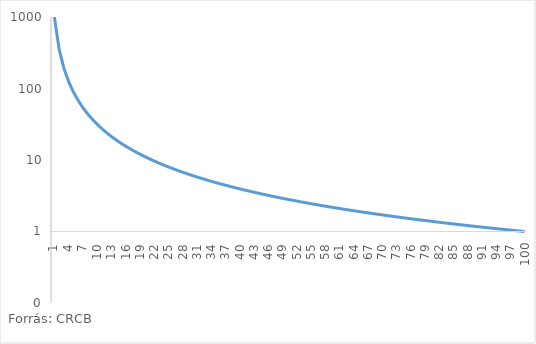
| Category | személyes kapcsolatok száma |
|---|---|
| 1.0 | 1000 |
| 2.0 | 353.553 |
| 3.0 | 192.45 |
| 4.0 | 125 |
| 5.0 | 89.443 |
| 6.0 | 68.041 |
| 7.0 | 53.995 |
| 8.0 | 44.194 |
| 9.0 | 37.037 |
| 10.0 | 31.623 |
| 11.0 | 27.41 |
| 12.0 | 24.056 |
| 13.0 | 21.335 |
| 14.0 | 19.09 |
| 15.0 | 17.213 |
| 16.0 | 15.625 |
| 17.0 | 14.267 |
| 18.0 | 13.095 |
| 19.0 | 12.075 |
| 20.0 | 11.18 |
| 21.0 | 10.391 |
| 22.0 | 9.691 |
| 23.0 | 9.066 |
| 24.0 | 8.505 |
| 25.0 | 8 |
| 26.0 | 7.543 |
| 27.0 | 7.128 |
| 28.0 | 6.749 |
| 29.0 | 6.403 |
| 30.0 | 6.086 |
| 31.0 | 5.794 |
| 32.0 | 5.524 |
| 33.0 | 5.275 |
| 34.0 | 5.044 |
| 35.0 | 4.829 |
| 36.0 | 4.63 |
| 37.0 | 4.443 |
| 38.0 | 4.269 |
| 39.0 | 4.106 |
| 40.0 | 3.953 |
| 41.0 | 3.809 |
| 42.0 | 3.674 |
| 43.0 | 3.546 |
| 44.0 | 3.426 |
| 45.0 | 3.313 |
| 46.0 | 3.205 |
| 47.0 | 3.104 |
| 48.0 | 3.007 |
| 49.0 | 2.915 |
| 50.0 | 2.828 |
| 51.0 | 2.746 |
| 52.0 | 2.667 |
| 53.0 | 2.592 |
| 54.0 | 2.52 |
| 55.0 | 2.452 |
| 56.0 | 2.386 |
| 57.0 | 2.324 |
| 58.0 | 2.264 |
| 59.0 | 2.207 |
| 60.0 | 2.152 |
| 61.0 | 2.099 |
| 62.0 | 2.048 |
| 63.0 | 2 |
| 64.0 | 1.953 |
| 65.0 | 1.908 |
| 66.0 | 1.865 |
| 67.0 | 1.823 |
| 68.0 | 1.783 |
| 69.0 | 1.745 |
| 70.0 | 1.707 |
| 71.0 | 1.672 |
| 72.0 | 1.637 |
| 73.0 | 1.603 |
| 74.0 | 1.571 |
| 75.0 | 1.54 |
| 76.0 | 1.509 |
| 77.0 | 1.48 |
| 78.0 | 1.452 |
| 79.0 | 1.424 |
| 80.0 | 1.398 |
| 81.0 | 1.372 |
| 82.0 | 1.347 |
| 83.0 | 1.322 |
| 84.0 | 1.299 |
| 85.0 | 1.276 |
| 86.0 | 1.254 |
| 87.0 | 1.232 |
| 88.0 | 1.211 |
| 89.0 | 1.191 |
| 90.0 | 1.171 |
| 91.0 | 1.152 |
| 92.0 | 1.133 |
| 93.0 | 1.115 |
| 94.0 | 1.097 |
| 95.0 | 1.08 |
| 96.0 | 1.063 |
| 97.0 | 1.047 |
| 98.0 | 1.031 |
| 99.0 | 1.015 |
| 100.0 | 1 |